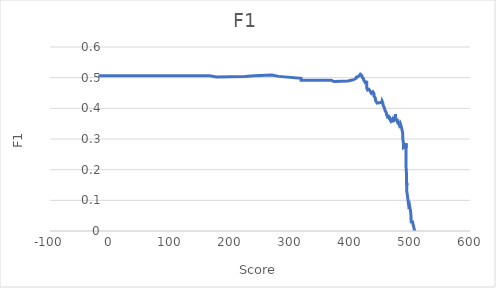
| Category | Series 0 |
|---|---|
| 507.8 | 0 |
| 507.8 | 0 |
| 504.1 | 0.03 |
| 502.0 | 0.03 |
| 501.3 | 0.06 |
| 498.9 | 0.087 |
| 498.9 | 0.086 |
| 498.7 | 0.085 |
| 497.8 | 0.083 |
| 497.1 | 0.083 |
| 496.2 | 0.108 |
| 495.8 | 0.107 |
| 495.1 | 0.107 |
| 494.5 | 0.132 |
| 494.5 | 0.154 |
| 494.5 | 0.152 |
| 494.5 | 0.15 |
| 494.5 | 0.148 |
| 494.5 | 0.148 |
| 494.2 | 0.169 |
| 494.1 | 0.169 |
| 494.0 | 0.19 |
| 493.4 | 0.209 |
| 493.4 | 0.209 |
| 493.4 | 0.227 |
| 493.3 | 0.227 |
| 493.3 | 0.244 |
| 493.2 | 0.242 |
| 493.2 | 0.242 |
| 493.2 | 0.261 |
| 493.2 | 0.277 |
| 493.2 | 0.274 |
| 493.2 | 0.271 |
| 493.2 | 0.271 |
| 493.2 | 0.286 |
| 493.2 | 0.283 |
| 493.2 | 0.28 |
| 492.4 | 0.277 |
| 491.4 | 0.275 |
| 490.0 | 0.272 |
| 489.3 | 0.272 |
| 489.1 | 0.286 |
| 488.5 | 0.283 |
| 488.3 | 0.283 |
| 488.1 | 0.299 |
| 488.1 | 0.315 |
| 486.7 | 0.33 |
| 485.2 | 0.342 |
| 485.2 | 0.339 |
| 484.8 | 0.339 |
| 483.8 | 0.351 |
| 482.9 | 0.348 |
| 482.2 | 0.345 |
| 481.6 | 0.345 |
| 480.1 | 0.356 |
| 479.7 | 0.353 |
| 479.7 | 0.353 |
| 479.5 | 0.364 |
| 479.1 | 0.361 |
| 478.4 | 0.358 |
| 477.8 | 0.355 |
| 477.3 | 0.355 |
| 476.7 | 0.365 |
| 476.2 | 0.362 |
| 476.2 | 0.359 |
| 476.0 | 0.359 |
| 476.0 | 0.372 |
| 475.7 | 0.382 |
| 475.7 | 0.379 |
| 475.6 | 0.376 |
| 475.5 | 0.373 |
| 474.3 | 0.37 |
| 474.1 | 0.368 |
| 474.1 | 0.365 |
| 473.6 | 0.362 |
| 472.9 | 0.36 |
| 472.9 | 0.357 |
| 472.9 | 0.357 |
| 472.9 | 0.366 |
| 472.6 | 0.364 |
| 472.6 | 0.361 |
| 472.5 | 0.359 |
| 472.3 | 0.356 |
| 471.7 | 0.356 |
| 471.7 | 0.365 |
| 471.7 | 0.362 |
| 471.5 | 0.36 |
| 470.9 | 0.36 |
| 470.7 | 0.368 |
| 470.7 | 0.366 |
| 470.7 | 0.364 |
| 470.7 | 0.361 |
| 470.7 | 0.359 |
| 470.7 | 0.357 |
| 470.3 | 0.354 |
| 470.0 | 0.354 |
| 469.7 | 0.362 |
| 468.7 | 0.36 |
| 468.2 | 0.358 |
| 467.6 | 0.356 |
| 467.3 | 0.356 |
| 465.7 | 0.366 |
| 465.7 | 0.373 |
| 465.6 | 0.371 |
| 465.6 | 0.369 |
| 465.2 | 0.367 |
| 464.6 | 0.367 |
| 464.3 | 0.374 |
| 462.5 | 0.372 |
| 461.1 | 0.37 |
| 461.1 | 0.37 |
| 461.1 | 0.379 |
| 460.4 | 0.386 |
| 459.1 | 0.386 |
| 458.4 | 0.393 |
| 457.4 | 0.393 |
| 457.1 | 0.402 |
| 455.0 | 0.411 |
| 454.7 | 0.418 |
| 454.6 | 0.418 |
| 453.4 | 0.424 |
| 452.8 | 0.422 |
| 452.8 | 0.419 |
| 452.1 | 0.417 |
| 445.3 | 0.417 |
| 442.6 | 0.426 |
| 442.1 | 0.434 |
| 440.1 | 0.44 |
| 440.1 | 0.44 |
| 440.1 | 0.448 |
| 438.2 | 0.454 |
| 438.2 | 0.451 |
| 435.7 | 0.449 |
| 435.0 | 0.449 |
| 433.4 | 0.457 |
| 431.4 | 0.462 |
| 429.2 | 0.46 |
| 429.2 | 0.458 |
| 428.7 | 0.458 |
| 428.1 | 0.465 |
| 428.1 | 0.473 |
| 428.0 | 0.48 |
| 427.9 | 0.485 |
| 426.0 | 0.485 |
| 426.0 | 0.49 |
| 425.1 | 0.488 |
| 424.9 | 0.486 |
| 423.9 | 0.486 |
| 422.7 | 0.493 |
| 422.2 | 0.498 |
| 421.8 | 0.495 |
| 421.7 | 0.495 |
| 421.0 | 0.5 |
| 420.5 | 0.5 |
| 419.7 | 0.507 |
| 417.2 | 0.511 |
| 416.7 | 0.509 |
| 415.6 | 0.507 |
| 414.6 | 0.505 |
| 414.4 | 0.505 |
| 414.2 | 0.509 |
| 414.2 | 0.507 |
| 413.9 | 0.504 |
| 410.7 | 0.502 |
| 410.6 | 0.5 |
| 410.4 | 0.498 |
| 408.0 | 0.496 |
| 406.2 | 0.494 |
| 404.9 | 0.491 |
| 396.5 | 0.489 |
| 396.0 | 0.487 |
| 373.2 | 0.487 |
| 368.6 | 0.492 |
| 318.5 | 0.492 |
| 318.5 | 0.498 |
| 281.3 | 0.504 |
| 269.5 | 0.508 |
| 240.7 | 0.506 |
| 224.4 | 0.504 |
| 224.4 | 0.502 |
| 177.6 | 0.502 |
| 166.2 | 0.506 |
| -19.3 | 0.506 |